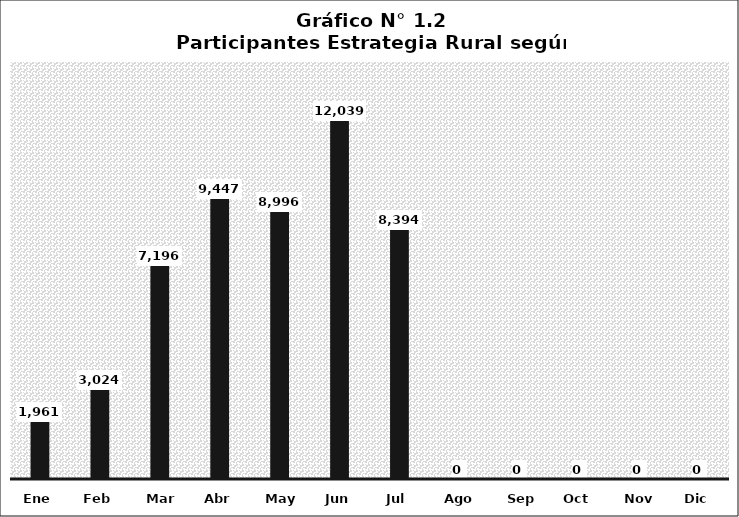
| Category | Series 0 |
|---|---|
| Ene | 1961 |
| Feb | 3024 |
| Mar | 7196 |
| Abr | 9447 |
| May | 8996 |
| Jun | 12039 |
| Jul | 8394 |
| Ago | 0 |
| Sep | 0 |
| Oct | 0 |
| Nov | 0 |
| Dic | 0 |